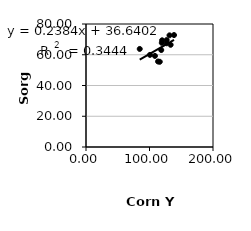
| Category | Series 0 |
|---|---|
| 119.3748675751375 | 67.744 |
| 119.84371061255356 | 69.396 |
| 84.61254935622317 | 63.779 |
| 116.16462652239014 | 55.428 |
| 118.50322619189868 | 63.077 |
| 108.58105654567375 | 59.256 |
| 131.48019479168113 | 72.616 |
| 100.70516997504808 | 59.912 |
| 138.6081880170675 | 72.805 |
| 113.45297330563889 | 55.614 |
| 127.05148536508675 | 67.471 |
| 127.04251220835594 | 69.546 |
| 133.29993630486928 | 66.469 |